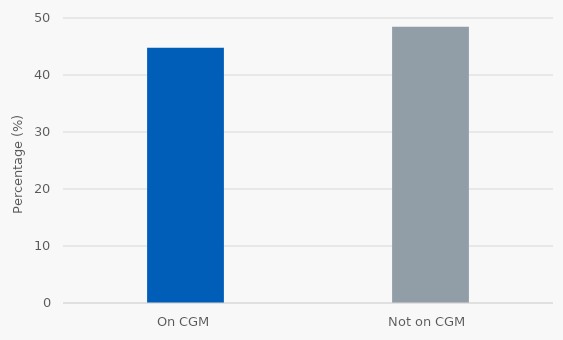
| Category | NNU admissions (%) |
|---|---|
| On CGM | 44.798 |
| Not on CGM | 48.466 |